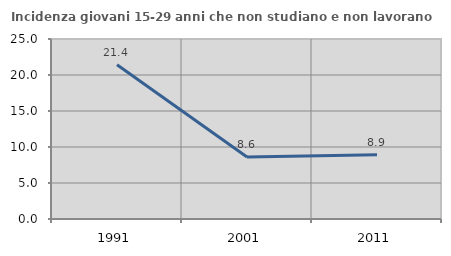
| Category | Incidenza giovani 15-29 anni che non studiano e non lavorano  |
|---|---|
| 1991.0 | 21.434 |
| 2001.0 | 8.6 |
| 2011.0 | 8.925 |